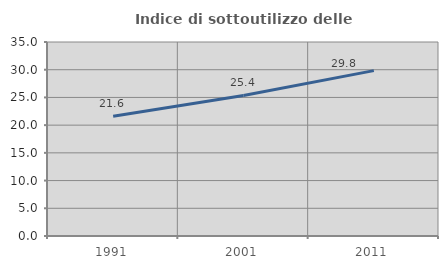
| Category | Indice di sottoutilizzo delle abitazioni  |
|---|---|
| 1991.0 | 21.601 |
| 2001.0 | 25.355 |
| 2011.0 | 29.838 |